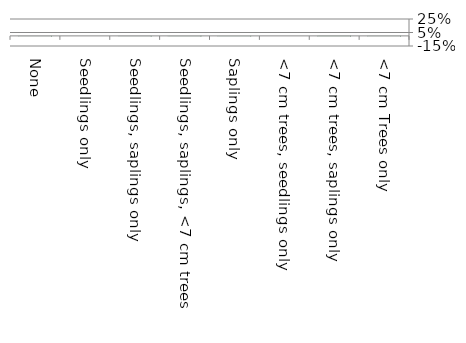
| Category | Near native & fragments |
|---|---|
| None | 0.001 |
| Seedlings only | 0 |
| Seedlings, saplings only | 0.001 |
| Seedlings, saplings, <7 cm trees | 0.004 |
| Saplings only | 0.003 |
| <7 cm trees, seedlings only | 0 |
| <7 cm trees, saplings only | 0.008 |
| <7 cm Trees only | 0.001 |